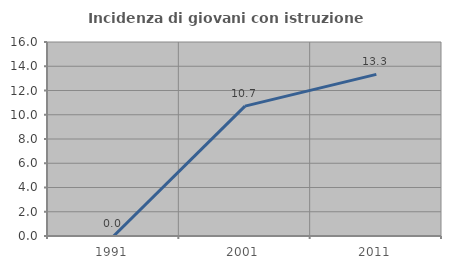
| Category | Incidenza di giovani con istruzione universitaria |
|---|---|
| 1991.0 | 0 |
| 2001.0 | 10.714 |
| 2011.0 | 13.333 |